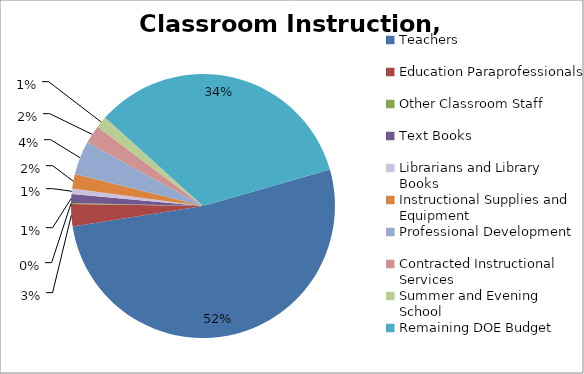
| Category | Series 0 |
|---|---|
| Teachers  | 6862 |
| Education Paraprofessionals  | 362 |
| Other Classroom Staff  | 16 |
| Text Books  | 140 |
| Librarians and Library Books  | 91 |
| Instructional Supplies and Equipment  | 233 |
| Professional Development  | 544 |
| Contracted Instructional Services  | 298 |
| Summer and Evening School  | 188 |
| Remaining DOE Budget | 4473 |